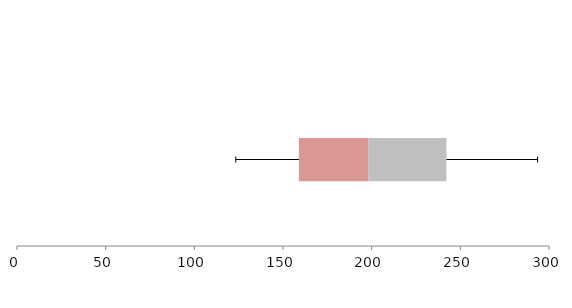
| Category | Series 1 | Series 2 | Series 3 |
|---|---|---|---|
| 0 | 158.97 | 39.248 | 43.963 |